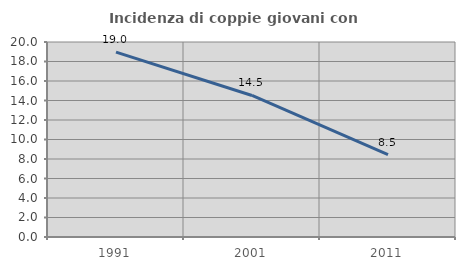
| Category | Incidenza di coppie giovani con figli |
|---|---|
| 1991.0 | 18.961 |
| 2001.0 | 14.516 |
| 2011.0 | 8.453 |